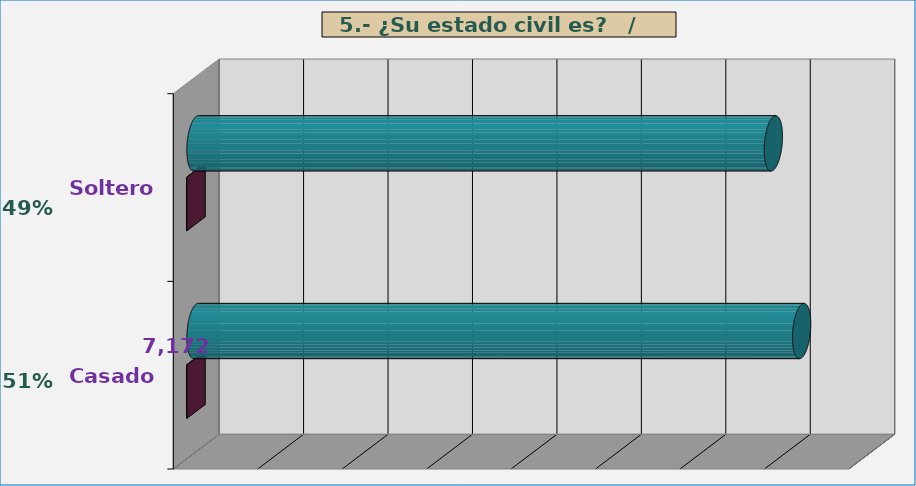
| Category | Series 0 | Series 1 |
|---|---|---|
| Solteros | 6837 | 0.488 |
| Casados | 7172 | 0.512 |